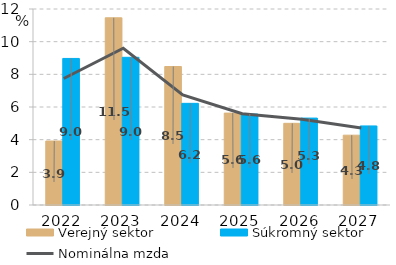
| Category | Verejný sektor | Súkromný sektor |
|---|---|---|
| 2022.0 | 3.916 | 8.973 |
| 2023.0 | 11.462 | 9.042 |
| 2024.0 | 8.479 | 6.223 |
| 2025.0 | 5.626 | 5.571 |
| 2026.0 | 5 | 5.321 |
| 2027.0 | 4.274 | 4.841 |